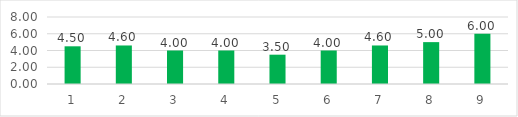
| Category | Series 0 |
|---|---|
| 0 | 4.5 |
| 1 | 4.6 |
| 2 | 4 |
| 3 | 4 |
| 4 | 3.5 |
| 5 | 4 |
| 6 | 4.6 |
| 7 | 5 |
| 8 | 6 |